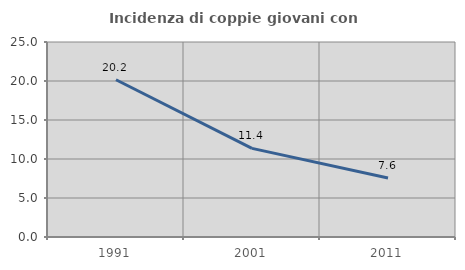
| Category | Incidenza di coppie giovani con figli |
|---|---|
| 1991.0 | 20.158 |
| 2001.0 | 11.36 |
| 2011.0 | 7.557 |